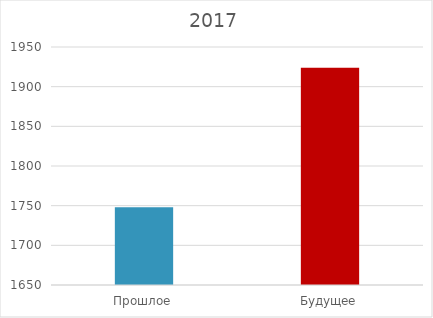
| Category | Series 0 |
|---|---|
| Прошлое | 1748 |
| Будущее | 1924 |